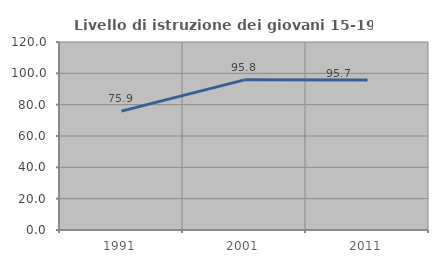
| Category | Livello di istruzione dei giovani 15-19 anni |
|---|---|
| 1991.0 | 75.889 |
| 2001.0 | 95.833 |
| 2011.0 | 95.722 |